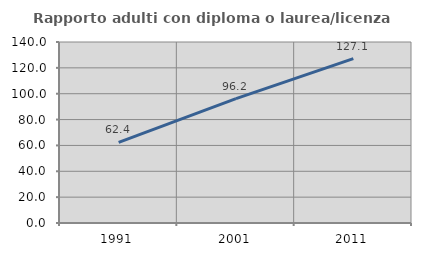
| Category | Rapporto adulti con diploma o laurea/licenza media  |
|---|---|
| 1991.0 | 62.4 |
| 2001.0 | 96.154 |
| 2011.0 | 127.083 |